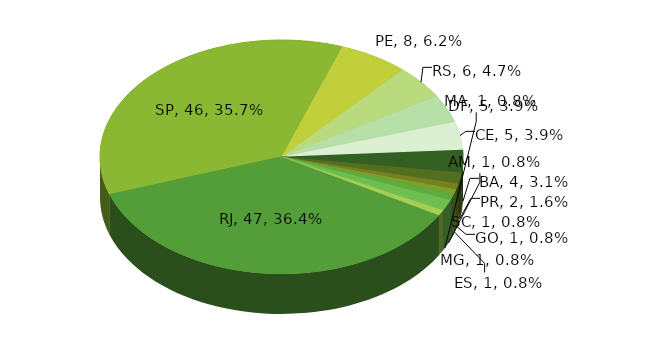
| Category | Series 0 |
|---|---|
| RJ | 47 |
| SP | 46 |
| PE | 8 |
| RS | 6 |
| DF | 5 |
| CE | 5 |
| BA | 4 |
| PR | 2 |
| GO | 1 |
| ES | 1 |
| SC | 1 |
| AM | 1 |
| MA | 1 |
| MG | 1 |